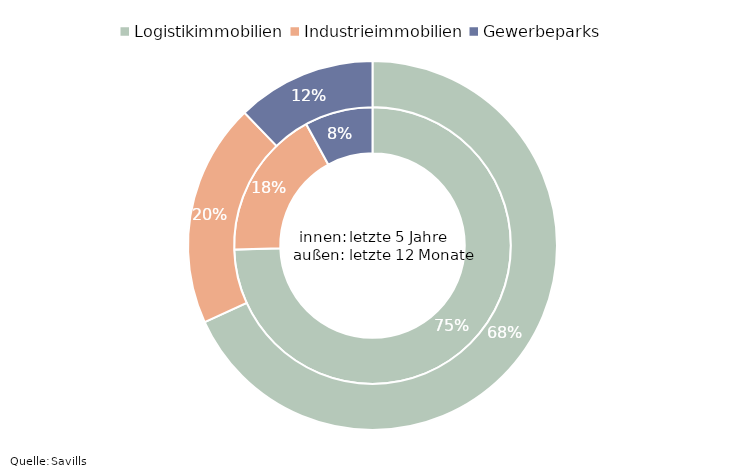
| Category | Series 1 | Series 0 |
|---|---|---|
| Logistikimmobilien | 0.745 | 0.682 |
| Industrieimmobilien | 0.175 | 0.196 |
| Gewerbeparks | 0.08 | 0.122 |